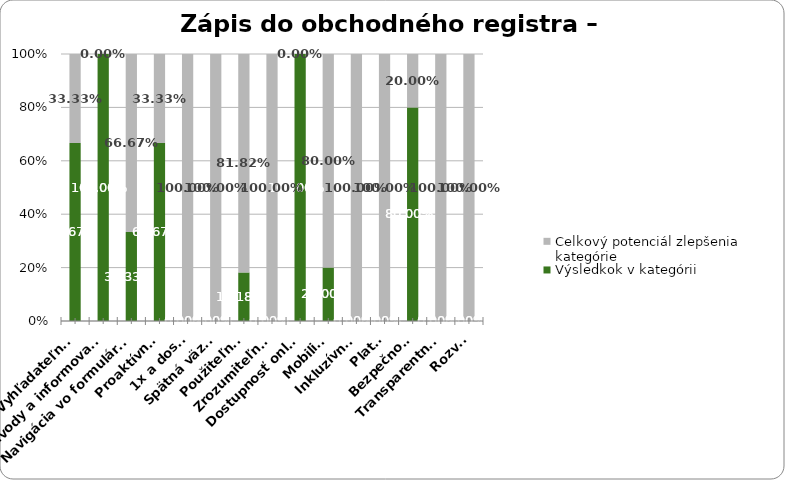
| Category | Výsledkok v kategórii | Celkový potenciál zlepšenia kategórie |
|---|---|---|
| Vyhľadateľnosť | 0.667 | 0.333 |
| Návody a informovanosť | 1 | 0 |
| Navigácia vo formulároch | 0.333 | 0.667 |
| Proaktívnosť | 0.667 | 0.333 |
| 1x a dosť! | 0 | 1 |
| Spätná väzba | 0 | 1 |
| Použiteľnosť | 0.182 | 0.818 |
| Zrozumiteľnosť | 0 | 1 |
| Dostupnosť online | 1 | 0 |
| Mobilita | 0.2 | 0.8 |
| Inkluzívnosť | 0 | 1 |
| Platba | 0 | 1 |
| Bezpečnosť | 0.8 | 0.2 |
| Transparentnosť | 0 | 1 |
| Rozvoj | 0 | 1 |